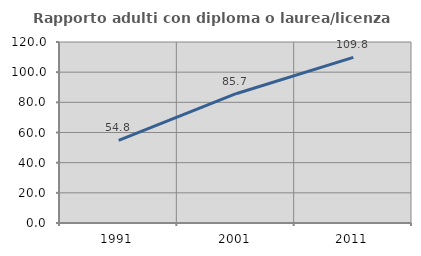
| Category | Rapporto adulti con diploma o laurea/licenza media  |
|---|---|
| 1991.0 | 54.833 |
| 2001.0 | 85.726 |
| 2011.0 | 109.77 |